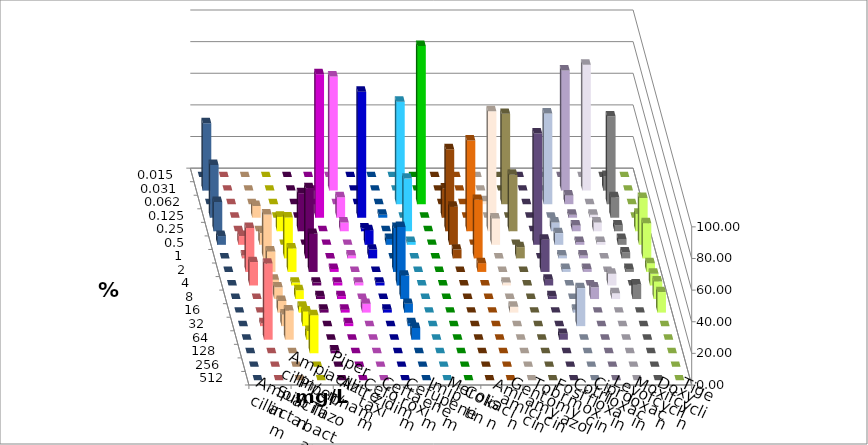
| Category | Ampicillin | Ampicillin/ Sulbactam | Piperacillin | Piperacillin/ Tazobactam | Aztreonam | Cefotaxim | Ceftazidim | Cefuroxim | Imipenem | Meropenem | Colistin | Amikacin | Gentamicin | Tobramycin | Fosfomycin | Cotrimoxazol | Ciprofloxacin | Levofloxacin | Moxifloxacin | Doxycyclin | Tigecyclin |
|---|---|---|---|---|---|---|---|---|---|---|---|---|---|---|---|---|---|---|---|---|---|
| 0.015 | 0 | 0 | 0 | 0 | 0 | 0 | 0 | 0 | 0 | 0 | 0 | 0 | 0 | 0 | 0 | 0 | 0 | 0 | 0 | 0 | 0 |
| 0.031 | 0 | 0 | 0 | 0 | 0 | 72.222 | 0 | 0 | 0 | 0 | 0 | 0 | 0 | 0 | 0 | 0 | 75.926 | 79.63 | 9.259 | 0 | 42.593 |
| 0.062 | 0 | 0 | 0 | 0 | 0 | 0 | 0 | 0 | 64.815 | 100 | 0 | 0 | 1.852 | 57.143 | 0 | 57.407 | 5.556 | 0 | 55.556 | 0 | 0 |
| 0.125 | 0 | 7.407 | 0 | 0 | 90.741 | 12.963 | 79.63 | 1.852 | 0 | 0 | 18.519 | 0 | 0 | 0 | 0 | 0 | 1.852 | 1.852 | 12.963 | 0 | 33.333 |
| 0.25 | 0 | 0 | 9.259 | 24.074 | 0 | 5.556 | 1.852 | 0 | 33.333 | 0 | 51.852 | 57.407 | 75.926 | 35.714 | 0 | 5.556 | 3.704 | 5.556 | 3.704 | 11.111 | 18.519 |
| 0.5 | 5.556 | 7.407 | 0 | 0 | 0 | 0 | 9.259 | 3.704 | 1.852 | 0 | 24.074 | 0 | 16.667 | 0 | 70.37 | 7.407 | 1.852 | 1.852 | 3.704 | 29.63 | 5.556 |
| 1.0 | 1.852 | 27.778 | 25.926 | 44.444 | 0 | 1.852 | 5.556 | 0 | 0 | 0 | 5.556 | 37.037 | 0 | 7.143 | 0 | 1.852 | 1.852 | 0 | 3.704 | 22.222 | 0 |
| 2.0 | 27.778 | 12.963 | 14.815 | 24.074 | 1.852 | 0 | 0 | 27.778 | 0 | 0 | 0 | 5.556 | 0 | 0 | 20.37 | 1.852 | 1.852 | 0 | 1.852 | 5.556 | 0 |
| 4.0 | 14.815 | 3.704 | 1.852 | 1.852 | 1.852 | 1.852 | 1.852 | 37.037 | 0 | 0 | 0 | 0 | 1.852 | 0 | 3.704 | 0 | 0 | 7.407 | 0 | 7.407 | 0 |
| 8.0 | 0 | 7.407 | 5.556 | 1.852 | 1.852 | 0 | 0 | 14.815 | 0 | 0 | 0 | 0 | 0 | 0 | 1.852 | 0 | 7.407 | 3.704 | 9.259 | 11.111 | 0 |
| 16.0 | 0 | 7.407 | 3.704 | 1.852 | 1.852 | 5.556 | 1.852 | 5.556 | 0 | 0 | 0 | 0 | 3.704 | 0 | 0 | 1.852 | 0 | 0 | 0 | 12.963 | 0 |
| 32.0 | 1.852 | 7.407 | 9.259 | 0 | 1.852 | 0 | 0 | 1.852 | 0 | 0 | 0 | 0 | 0 | 0 | 0 | 24.074 | 0 | 0 | 0 | 0 | 0 |
| 64.0 | 48.148 | 18.519 | 5.556 | 0 | 0 | 0 | 0 | 7.407 | 0 | 0 | 0 | 0 | 0 | 0 | 3.704 | 0 | 0 | 0 | 0 | 0 | 0 |
| 128.0 | 0 | 0 | 24.074 | 1.852 | 0 | 0 | 0 | 0 | 0 | 0 | 0 | 0 | 0 | 0 | 0 | 0 | 0 | 0 | 0 | 0 | 0 |
| 256.0 | 0 | 0 | 0 | 0 | 0 | 0 | 0 | 0 | 0 | 0 | 0 | 0 | 0 | 0 | 0 | 0 | 0 | 0 | 0 | 0 | 0 |
| 512.0 | 0 | 0 | 0 | 0 | 0 | 0 | 0 | 0 | 0 | 0 | 0 | 0 | 0 | 0 | 0 | 0 | 0 | 0 | 0 | 0 | 0 |